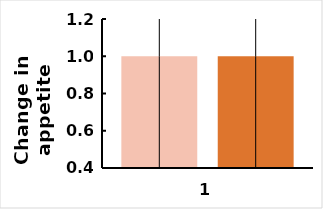
| Category | Series 2 | Series 3 | Series 1 | Series 0 |
|---|---|---|---|---|
| 0 |  | 1 | 1 |  |